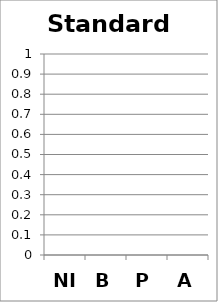
| Category | Standard 10 |
|---|---|
| NI | 0 |
| B | 0 |
| P | 0 |
| A | 0 |